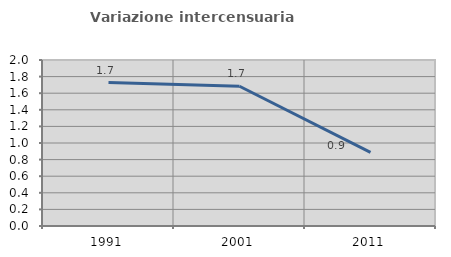
| Category | Variazione intercensuaria annua |
|---|---|
| 1991.0 | 1.728 |
| 2001.0 | 1.684 |
| 2011.0 | 0.887 |